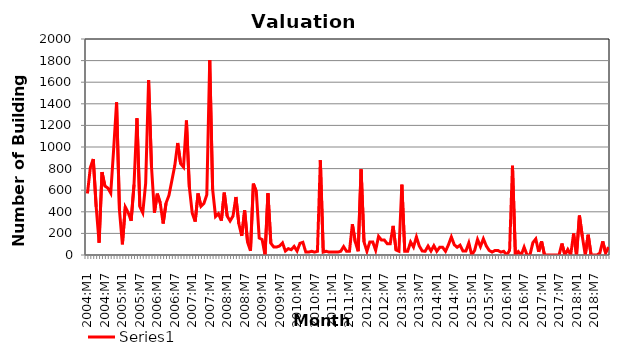
| Category | Series 0 |
|---|---|
| 2004:M1 | 569.625 |
| 2004:M2 | 810.875 |
| 2004:M3 | 889.125 |
| 2004:M4 | 446.375 |
| 2004:M5 | 113.875 |
| 2004:M6 | 766.875 |
| 2004:M7 | 638.5 |
| 2004:M8 | 620.25 |
| 2004:M9 | 573.125 |
| 2004:M10 | 979.375 |
| 2004:M11 | 1412.875 |
| 2004:M12 | 412.25 |
| 2005:M1 | 99.25 |
| 2005:M2 | 444 |
| 2005:M3 | 392 |
| 2005:M4 | 316.875 |
| 2005:M5 | 652.625 |
| 2005:M6 | 1266.5 |
| 2005:M7 | 448.75 |
| 2005:M8 | 391 |
| 2005:M9 | 665.625 |
| 2005:M10 | 1620.75 |
| 2005:M11 | 817 |
| 2005:M12 | 392.75 |
| 2006:M1 | 568 |
| 2006:M2 | 481.75 |
| 2006:M3 | 291.25 |
| 2006:M4 | 480.625 |
| 2006:M5 | 553.125 |
| 2006:M6 | 690.25 |
| 2006:M7 | 827.75 |
| 2006:M8 | 1036.75 |
| 2006:M9 | 846 |
| 2006:M10 | 813.25 |
| 2006:M11 | 1245.625 |
| 2006:M12 | 627.25 |
| 2007:M1 | 387.5 |
| 2007:M2 | 309.25 |
| 2007:M3 | 569.5 |
| 2007:M4 | 450.625 |
| 2007:M5 | 477.25 |
| 2007:M6 | 557.125 |
| 2007:M7 | 1804.625 |
| 2007:M8 | 606.375 |
| 2007:M9 | 356.5 |
| 2007:M10 | 382.375 |
| 2007:M11 | 318.5 |
| 2007:M12 | 577.375 |
| 2008:M1 | 360 |
| 2008:M2 | 315.375 |
| 2008:M3 | 361 |
| 2008:M4 | 537 |
| 2008:M5 | 288.5 |
| 2008:M6 | 177.25 |
| 2008:M7 | 412.375 |
| 2008:M8 | 118.875 |
| 2008:M9 | 39.25 |
| 2008:M10 | 660.5 |
| 2008:M11 | 588 |
| 2008:M12 | 156.5 |
| 2009:M1 | 143.625 |
| 2009:M2 | 0 |
| 2009:M3 | 572 |
| 2009:M4 | 109 |
| 2009:M5 | 73.875 |
| 2009:M6 | 73.875 |
| 2009:M7 | 83.75 |
| 2009:M8 | 112 |
| 2009:M9 | 36.875 |
| 2009:M10 | 58.5 |
| 2009:M11 | 49.25 |
| 2009:M12 | 79.375 |
| 2010:M1 | 36.875 |
| 2010:M2 | 108.375 |
| 2010:M3 | 117.625 |
| 2010:M4 | 26.875 |
| 2010:M5 | 26.875 |
| 2010:M6 | 34.5 |
| 2010:M7 | 26.875 |
| 2010:M8 | 34.5 |
| 2010:M9 | 876.75 |
| 2010:M10 | 26.875 |
| 2010:M11 | 34.5 |
| 2010:M12 | 26.875 |
| 2011:M1 | 26.875 |
| 2011:M2 | 26.875 |
| 2011:M3 | 26.875 |
| 2011:M4 | 34.5 |
| 2011:M5 | 77.5 |
| 2011:M6 | 34.5 |
| 2011:M7 | 34.5 |
| 2011:M8 | 284.5 |
| 2011:M9 | 121.125 |
| 2011:M10 | 34.5 |
| 2011:M11 | 792.375 |
| 2011:M12 | 121.125 |
| 2012:M1 | 34.5 |
| 2012:M2 | 121.125 |
| 2012:M3 | 121.125 |
| 2012:M4 | 44.5 |
| 2012:M5 | 172.375 |
| 2012:M6 | 138 |
| 2012:M7 | 138 |
| 2012:M8 | 103.5 |
| 2012:M9 | 103.5 |
| 2012:M10 | 269.625 |
| 2012:M11 | 45.875 |
| 2012:M12 | 34.5 |
| 2013:M1 | 651.125 |
| 2013:M2 | 34.5 |
| 2013:M3 | 34.5 |
| 2013:M4 | 120.375 |
| 2013:M5 | 73.625 |
| 2013:M6 | 167 |
| 2013:M7 | 82.75 |
| 2013:M8 | 36.875 |
| 2013:M9 | 34.5 |
| 2013:M10 | 82.75 |
| 2013:M11 | 36.875 |
| 2013:M12 | 85.875 |
| 2014:M1 | 34.5 |
| 2014:M2 | 71.375 |
| 2014:M3 | 71.375 |
| 2014:M4 | 34.5 |
| 2014:M5 | 94.375 |
| 2014:M6 | 167 |
| 2014:M7 | 95 |
| 2014:M8 | 71.375 |
| 2014:M9 | 90.875 |
| 2014:M10 | 36.875 |
| 2014:M11 | 36.875 |
| 2014:M12 | 111.875 |
| 2015:M1 | 0 |
| 2015:M2 | 42.143 |
| 2015:M3 | 144 |
| 2015:M4 | 78.143 |
| 2015:M5 | 150 |
| 2015:M6 | 84.286 |
| 2015:M7 | 42.143 |
| 2015:M8 | 27 |
| 2015:M9 | 42.143 |
| 2015:M10 | 42.143 |
| 2015:M11 | 27 |
| 2015:M12 | 34.143 |
| 2016:M1 | 0 |
| 2016:M2 | 42.143 |
| 2016:M3 | 825.714 |
| 2016:M4 | 0 |
| 2016:M5 | 31.571 |
| 2016:M6 | 0 |
| 2016:M7 | 72.714 |
| 2016:M8 | 0 |
| 2016:M9 | 0 |
| 2016:M10 | 114 |
| 2016:M11 | 148.571 |
| 2016:M12 | 29.286 |
| 2017:M1 | 125.857 |
| 2017:M2 | 0 |
| 2017:M3 | 0 |
| 2017:M4 | 0 |
| 2017:M5 | 0 |
| 2017:M6 | 0 |
| 2017:M7 | 0 |
| 2017:M8 | 106.571 |
| 2017:M9 | 0 |
| 2017:M10 | 51 |
| 2017:M11 | 0 |
| 2017:M12 | 199 |
| 2018:M1 | 0 |
| 2018:M2 | 365.143 |
| 2018:M3 | 170.286 |
| 2018:M4 | 0 |
| 2018:M5 | 187.429 |
| 2018:M6 | 0 |
| 2018:M7 | 0 |
| 2018:M8 | 0 |
| 2018:M9 | 17.714 |
| 2018:M10 | 126 |
| 2018:M11 | 17.714 |
| 2018:M12 | 73.143 |